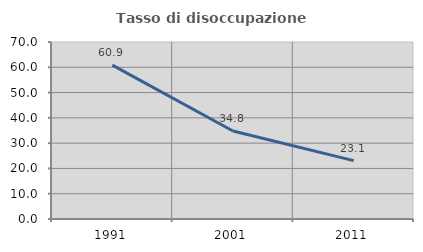
| Category | Tasso di disoccupazione giovanile  |
|---|---|
| 1991.0 | 60.87 |
| 2001.0 | 34.783 |
| 2011.0 | 23.077 |